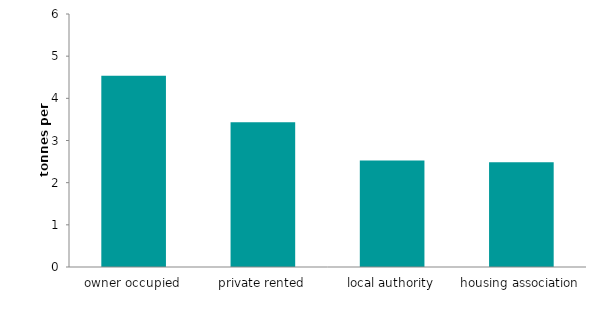
| Category | Series 0 |
|---|---|
| owner occupied | 4.535 |
| private rented | 3.436 |
| local authority | 2.528 |
| housing association | 2.482 |